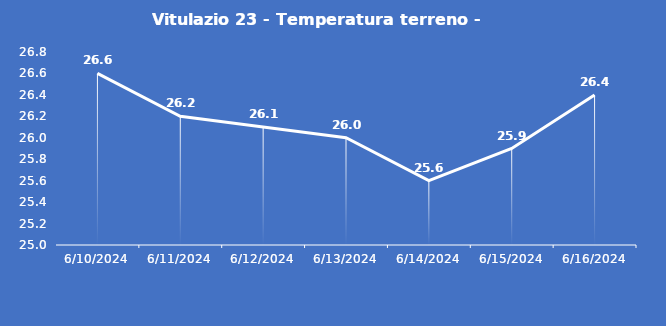
| Category | Vitulazio 23 - Temperatura terreno - Grezzo (°C) |
|---|---|
| 6/10/24 | 26.6 |
| 6/11/24 | 26.2 |
| 6/12/24 | 26.1 |
| 6/13/24 | 26 |
| 6/14/24 | 25.6 |
| 6/15/24 | 25.9 |
| 6/16/24 | 26.4 |